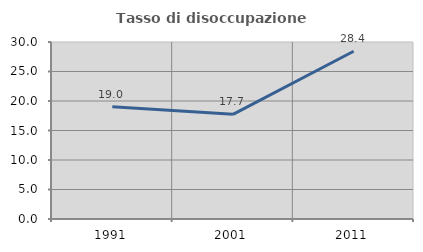
| Category | Tasso di disoccupazione giovanile  |
|---|---|
| 1991.0 | 19.02 |
| 2001.0 | 17.742 |
| 2011.0 | 28.425 |